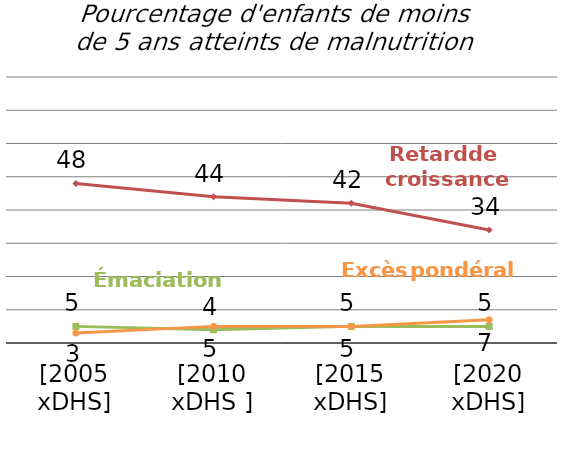
| Category | Retard de croissance | Émaciation | #REF! | Excès pondéral |
|---|---|---|---|---|
| [2005
xDHS] | 48 | 5 |  | 3 |
| [2010
xDHS ] | 44 | 4 |  | 5 |
| [2015
xDHS] | 42 | 5 |  | 5 |
| [2020
xDHS] | 34 | 5 |  | 7 |